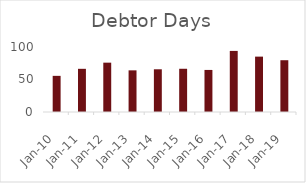
| Category | Debtor Days |
|---|---|
| 2010-03-31 | 55.602 |
| 2011-03-31 | 66.43 |
| 2012-03-31 | 75.909 |
| 2013-03-31 | 64.079 |
| 2014-03-31 | 65.72 |
| 2015-03-31 | 66.508 |
| 2016-03-31 | 64.71 |
| 2017-03-31 | 93.984 |
| 2018-03-31 | 85.191 |
| 2019-03-31 | 79.668 |